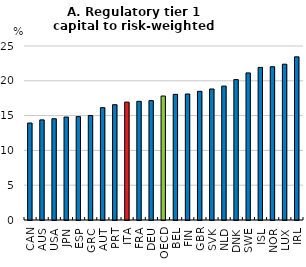
| Category | Regulatory Tier 1 Capital to Risk-Weighted Assets, Percent |
|---|---|
| CAN | 13.934 |
| AUS | 14.386 |
| USA | 14.549 |
| JPN | 14.79 |
| ESP | 14.849 |
| GRC | 15.01 |
| AUT | 16.139 |
| PRT | 16.567 |
| ITA | 16.938 |
| FRA | 17.051 |
| DEU | 17.15 |
| OECD | 17.812 |
| BEL | 18.054 |
| FIN | 18.106 |
| GBR | 18.489 |
| SVK | 18.823 |
| NLD | 19.239 |
| DNK | 20.174 |
| SWE | 21.136 |
| ISL | 21.922 |
| NOR | 22.024 |
| LUX | 22.385 |
| IRL | 23.443 |